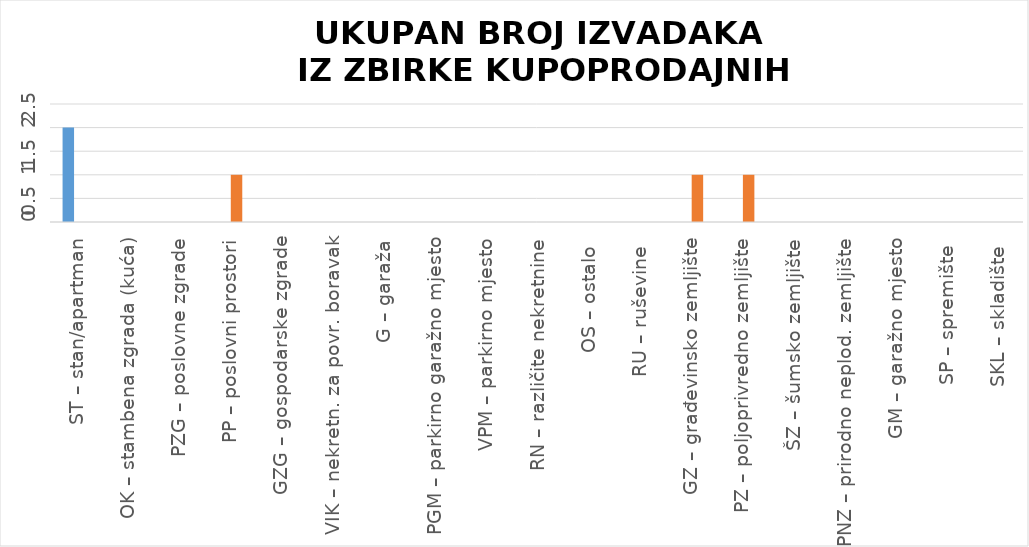
| Category | BROJ IZDANIH IZVADAKA - Zahtjev predan u eNekretninama | BROJ IZDANIH IZVADAKA -  
Zahtjev predan osobno |
|---|---|---|
| ST – stan/apartman | 2 | 0 |
| OK – stambena zgrada (kuća) | 0 | 0 |
| PZG – poslovne zgrade | 0 | 0 |
| PP – poslovni prostori | 0 | 1 |
| GZG – gospodarske zgrade | 0 | 0 |
| VIK – nekretn. za povr. boravak | 0 | 0 |
| G – garaža | 0 | 0 |
| PGM – parkirno garažno mjesto | 0 | 0 |
| VPM – parkirno mjesto | 0 | 0 |
| RN – različite nekretnine | 0 | 0 |
| OS – ostalo  | 0 | 0 |
| RU – ruševine  | 0 | 0 |
| GZ – građevinsko zemljište | 0 | 1 |
| PZ – poljoprivredno zemljište | 0 | 1 |
| ŠZ – šumsko zemljište | 0 | 0 |
| PNZ – prirodno neplod. zemljište | 0 | 0 |
| GM – garažno mjesto | 0 | 0 |
| SP – spremište  | 0 | 0 |
| SKL – skladište  | 0 | 0 |